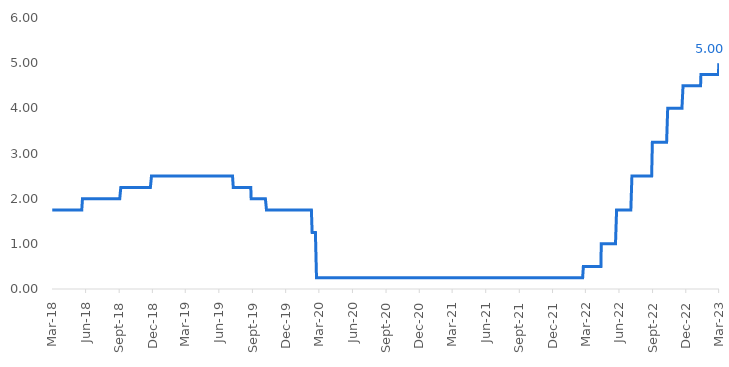
| Category | DFEDTARU |
|---|---|
| 2018-03-23 | 1.75 |
| 2018-03-24 | 1.75 |
| 2018-03-25 | 1.75 |
| 2018-03-26 | 1.75 |
| 2018-03-27 | 1.75 |
| 2018-03-28 | 1.75 |
| 2018-03-29 | 1.75 |
| 2018-03-30 | 1.75 |
| 2018-03-31 | 1.75 |
| 2018-04-01 | 1.75 |
| 2018-04-02 | 1.75 |
| 2018-04-03 | 1.75 |
| 2018-04-04 | 1.75 |
| 2018-04-05 | 1.75 |
| 2018-04-06 | 1.75 |
| 2018-04-07 | 1.75 |
| 2018-04-08 | 1.75 |
| 2018-04-09 | 1.75 |
| 2018-04-10 | 1.75 |
| 2018-04-11 | 1.75 |
| 2018-04-12 | 1.75 |
| 2018-04-13 | 1.75 |
| 2018-04-14 | 1.75 |
| 2018-04-15 | 1.75 |
| 2018-04-16 | 1.75 |
| 2018-04-17 | 1.75 |
| 2018-04-18 | 1.75 |
| 2018-04-19 | 1.75 |
| 2018-04-20 | 1.75 |
| 2018-04-21 | 1.75 |
| 2018-04-22 | 1.75 |
| 2018-04-23 | 1.75 |
| 2018-04-24 | 1.75 |
| 2018-04-25 | 1.75 |
| 2018-04-26 | 1.75 |
| 2018-04-27 | 1.75 |
| 2018-04-28 | 1.75 |
| 2018-04-29 | 1.75 |
| 2018-04-30 | 1.75 |
| 2018-05-01 | 1.75 |
| 2018-05-02 | 1.75 |
| 2018-05-03 | 1.75 |
| 2018-05-04 | 1.75 |
| 2018-05-05 | 1.75 |
| 2018-05-06 | 1.75 |
| 2018-05-07 | 1.75 |
| 2018-05-08 | 1.75 |
| 2018-05-09 | 1.75 |
| 2018-05-10 | 1.75 |
| 2018-05-11 | 1.75 |
| 2018-05-12 | 1.75 |
| 2018-05-13 | 1.75 |
| 2018-05-14 | 1.75 |
| 2018-05-15 | 1.75 |
| 2018-05-16 | 1.75 |
| 2018-05-17 | 1.75 |
| 2018-05-18 | 1.75 |
| 2018-05-19 | 1.75 |
| 2018-05-20 | 1.75 |
| 2018-05-21 | 1.75 |
| 2018-05-22 | 1.75 |
| 2018-05-23 | 1.75 |
| 2018-05-24 | 1.75 |
| 2018-05-25 | 1.75 |
| 2018-05-26 | 1.75 |
| 2018-05-27 | 1.75 |
| 2018-05-28 | 1.75 |
| 2018-05-29 | 1.75 |
| 2018-05-30 | 1.75 |
| 2018-05-31 | 1.75 |
| 2018-06-01 | 1.75 |
| 2018-06-02 | 1.75 |
| 2018-06-03 | 1.75 |
| 2018-06-04 | 1.75 |
| 2018-06-05 | 1.75 |
| 2018-06-06 | 1.75 |
| 2018-06-07 | 1.75 |
| 2018-06-08 | 1.75 |
| 2018-06-09 | 1.75 |
| 2018-06-10 | 1.75 |
| 2018-06-11 | 1.75 |
| 2018-06-12 | 1.75 |
| 2018-06-13 | 1.75 |
| 2018-06-14 | 2 |
| 2018-06-15 | 2 |
| 2018-06-16 | 2 |
| 2018-06-17 | 2 |
| 2018-06-18 | 2 |
| 2018-06-19 | 2 |
| 2018-06-20 | 2 |
| 2018-06-21 | 2 |
| 2018-06-22 | 2 |
| 2018-06-23 | 2 |
| 2018-06-24 | 2 |
| 2018-06-25 | 2 |
| 2018-06-26 | 2 |
| 2018-06-27 | 2 |
| 2018-06-28 | 2 |
| 2018-06-29 | 2 |
| 2018-06-30 | 2 |
| 2018-07-01 | 2 |
| 2018-07-02 | 2 |
| 2018-07-03 | 2 |
| 2018-07-04 | 2 |
| 2018-07-05 | 2 |
| 2018-07-06 | 2 |
| 2018-07-07 | 2 |
| 2018-07-08 | 2 |
| 2018-07-09 | 2 |
| 2018-07-10 | 2 |
| 2018-07-11 | 2 |
| 2018-07-12 | 2 |
| 2018-07-13 | 2 |
| 2018-07-14 | 2 |
| 2018-07-15 | 2 |
| 2018-07-16 | 2 |
| 2018-07-17 | 2 |
| 2018-07-18 | 2 |
| 2018-07-19 | 2 |
| 2018-07-20 | 2 |
| 2018-07-21 | 2 |
| 2018-07-22 | 2 |
| 2018-07-23 | 2 |
| 2018-07-24 | 2 |
| 2018-07-25 | 2 |
| 2018-07-26 | 2 |
| 2018-07-27 | 2 |
| 2018-07-28 | 2 |
| 2018-07-29 | 2 |
| 2018-07-30 | 2 |
| 2018-07-31 | 2 |
| 2018-08-01 | 2 |
| 2018-08-02 | 2 |
| 2018-08-03 | 2 |
| 2018-08-04 | 2 |
| 2018-08-05 | 2 |
| 2018-08-06 | 2 |
| 2018-08-07 | 2 |
| 2018-08-08 | 2 |
| 2018-08-09 | 2 |
| 2018-08-10 | 2 |
| 2018-08-11 | 2 |
| 2018-08-12 | 2 |
| 2018-08-13 | 2 |
| 2018-08-14 | 2 |
| 2018-08-15 | 2 |
| 2018-08-16 | 2 |
| 2018-08-17 | 2 |
| 2018-08-18 | 2 |
| 2018-08-19 | 2 |
| 2018-08-20 | 2 |
| 2018-08-21 | 2 |
| 2018-08-22 | 2 |
| 2018-08-23 | 2 |
| 2018-08-24 | 2 |
| 2018-08-25 | 2 |
| 2018-08-26 | 2 |
| 2018-08-27 | 2 |
| 2018-08-28 | 2 |
| 2018-08-29 | 2 |
| 2018-08-30 | 2 |
| 2018-08-31 | 2 |
| 2018-09-01 | 2 |
| 2018-09-02 | 2 |
| 2018-09-03 | 2 |
| 2018-09-04 | 2 |
| 2018-09-05 | 2 |
| 2018-09-06 | 2 |
| 2018-09-07 | 2 |
| 2018-09-08 | 2 |
| 2018-09-09 | 2 |
| 2018-09-10 | 2 |
| 2018-09-11 | 2 |
| 2018-09-12 | 2 |
| 2018-09-13 | 2 |
| 2018-09-14 | 2 |
| 2018-09-15 | 2 |
| 2018-09-16 | 2 |
| 2018-09-17 | 2 |
| 2018-09-18 | 2 |
| 2018-09-19 | 2 |
| 2018-09-20 | 2 |
| 2018-09-21 | 2 |
| 2018-09-22 | 2 |
| 2018-09-23 | 2 |
| 2018-09-24 | 2 |
| 2018-09-25 | 2 |
| 2018-09-26 | 2 |
| 2018-09-27 | 2.25 |
| 2018-09-28 | 2.25 |
| 2018-09-29 | 2.25 |
| 2018-09-30 | 2.25 |
| 2018-10-01 | 2.25 |
| 2018-10-02 | 2.25 |
| 2018-10-03 | 2.25 |
| 2018-10-04 | 2.25 |
| 2018-10-05 | 2.25 |
| 2018-10-06 | 2.25 |
| 2018-10-07 | 2.25 |
| 2018-10-08 | 2.25 |
| 2018-10-09 | 2.25 |
| 2018-10-10 | 2.25 |
| 2018-10-11 | 2.25 |
| 2018-10-12 | 2.25 |
| 2018-10-13 | 2.25 |
| 2018-10-14 | 2.25 |
| 2018-10-15 | 2.25 |
| 2018-10-16 | 2.25 |
| 2018-10-17 | 2.25 |
| 2018-10-18 | 2.25 |
| 2018-10-19 | 2.25 |
| 2018-10-20 | 2.25 |
| 2018-10-21 | 2.25 |
| 2018-10-22 | 2.25 |
| 2018-10-23 | 2.25 |
| 2018-10-24 | 2.25 |
| 2018-10-25 | 2.25 |
| 2018-10-26 | 2.25 |
| 2018-10-27 | 2.25 |
| 2018-10-28 | 2.25 |
| 2018-10-29 | 2.25 |
| 2018-10-30 | 2.25 |
| 2018-10-31 | 2.25 |
| 2018-11-01 | 2.25 |
| 2018-11-02 | 2.25 |
| 2018-11-03 | 2.25 |
| 2018-11-04 | 2.25 |
| 2018-11-05 | 2.25 |
| 2018-11-06 | 2.25 |
| 2018-11-07 | 2.25 |
| 2018-11-08 | 2.25 |
| 2018-11-09 | 2.25 |
| 2018-11-10 | 2.25 |
| 2018-11-11 | 2.25 |
| 2018-11-12 | 2.25 |
| 2018-11-13 | 2.25 |
| 2018-11-14 | 2.25 |
| 2018-11-15 | 2.25 |
| 2018-11-16 | 2.25 |
| 2018-11-17 | 2.25 |
| 2018-11-18 | 2.25 |
| 2018-11-19 | 2.25 |
| 2018-11-20 | 2.25 |
| 2018-11-21 | 2.25 |
| 2018-11-22 | 2.25 |
| 2018-11-23 | 2.25 |
| 2018-11-24 | 2.25 |
| 2018-11-25 | 2.25 |
| 2018-11-26 | 2.25 |
| 2018-11-27 | 2.25 |
| 2018-11-28 | 2.25 |
| 2018-11-29 | 2.25 |
| 2018-11-30 | 2.25 |
| 2018-12-01 | 2.25 |
| 2018-12-02 | 2.25 |
| 2018-12-03 | 2.25 |
| 2018-12-04 | 2.25 |
| 2018-12-05 | 2.25 |
| 2018-12-06 | 2.25 |
| 2018-12-07 | 2.25 |
| 2018-12-08 | 2.25 |
| 2018-12-09 | 2.25 |
| 2018-12-10 | 2.25 |
| 2018-12-11 | 2.25 |
| 2018-12-12 | 2.25 |
| 2018-12-13 | 2.25 |
| 2018-12-14 | 2.25 |
| 2018-12-15 | 2.25 |
| 2018-12-16 | 2.25 |
| 2018-12-17 | 2.25 |
| 2018-12-18 | 2.25 |
| 2018-12-19 | 2.25 |
| 2018-12-20 | 2.5 |
| 2018-12-21 | 2.5 |
| 2018-12-22 | 2.5 |
| 2018-12-23 | 2.5 |
| 2018-12-24 | 2.5 |
| 2018-12-25 | 2.5 |
| 2018-12-26 | 2.5 |
| 2018-12-27 | 2.5 |
| 2018-12-28 | 2.5 |
| 2018-12-29 | 2.5 |
| 2018-12-30 | 2.5 |
| 2018-12-31 | 2.5 |
| 2019-01-01 | 2.5 |
| 2019-01-02 | 2.5 |
| 2019-01-03 | 2.5 |
| 2019-01-04 | 2.5 |
| 2019-01-05 | 2.5 |
| 2019-01-06 | 2.5 |
| 2019-01-07 | 2.5 |
| 2019-01-08 | 2.5 |
| 2019-01-09 | 2.5 |
| 2019-01-10 | 2.5 |
| 2019-01-11 | 2.5 |
| 2019-01-12 | 2.5 |
| 2019-01-13 | 2.5 |
| 2019-01-14 | 2.5 |
| 2019-01-15 | 2.5 |
| 2019-01-16 | 2.5 |
| 2019-01-17 | 2.5 |
| 2019-01-18 | 2.5 |
| 2019-01-19 | 2.5 |
| 2019-01-20 | 2.5 |
| 2019-01-21 | 2.5 |
| 2019-01-22 | 2.5 |
| 2019-01-23 | 2.5 |
| 2019-01-24 | 2.5 |
| 2019-01-25 | 2.5 |
| 2019-01-26 | 2.5 |
| 2019-01-27 | 2.5 |
| 2019-01-28 | 2.5 |
| 2019-01-29 | 2.5 |
| 2019-01-30 | 2.5 |
| 2019-01-31 | 2.5 |
| 2019-02-01 | 2.5 |
| 2019-02-02 | 2.5 |
| 2019-02-03 | 2.5 |
| 2019-02-04 | 2.5 |
| 2019-02-05 | 2.5 |
| 2019-02-06 | 2.5 |
| 2019-02-07 | 2.5 |
| 2019-02-08 | 2.5 |
| 2019-02-09 | 2.5 |
| 2019-02-10 | 2.5 |
| 2019-02-11 | 2.5 |
| 2019-02-12 | 2.5 |
| 2019-02-13 | 2.5 |
| 2019-02-14 | 2.5 |
| 2019-02-15 | 2.5 |
| 2019-02-16 | 2.5 |
| 2019-02-17 | 2.5 |
| 2019-02-18 | 2.5 |
| 2019-02-19 | 2.5 |
| 2019-02-20 | 2.5 |
| 2019-02-21 | 2.5 |
| 2019-02-22 | 2.5 |
| 2019-02-23 | 2.5 |
| 2019-02-24 | 2.5 |
| 2019-02-25 | 2.5 |
| 2019-02-26 | 2.5 |
| 2019-02-27 | 2.5 |
| 2019-02-28 | 2.5 |
| 2019-03-01 | 2.5 |
| 2019-03-02 | 2.5 |
| 2019-03-03 | 2.5 |
| 2019-03-04 | 2.5 |
| 2019-03-05 | 2.5 |
| 2019-03-06 | 2.5 |
| 2019-03-07 | 2.5 |
| 2019-03-08 | 2.5 |
| 2019-03-09 | 2.5 |
| 2019-03-10 | 2.5 |
| 2019-03-11 | 2.5 |
| 2019-03-12 | 2.5 |
| 2019-03-13 | 2.5 |
| 2019-03-14 | 2.5 |
| 2019-03-15 | 2.5 |
| 2019-03-16 | 2.5 |
| 2019-03-17 | 2.5 |
| 2019-03-18 | 2.5 |
| 2019-03-19 | 2.5 |
| 2019-03-20 | 2.5 |
| 2019-03-21 | 2.5 |
| 2019-03-22 | 2.5 |
| 2019-03-23 | 2.5 |
| 2019-03-24 | 2.5 |
| 2019-03-25 | 2.5 |
| 2019-03-26 | 2.5 |
| 2019-03-27 | 2.5 |
| 2019-03-28 | 2.5 |
| 2019-03-29 | 2.5 |
| 2019-03-30 | 2.5 |
| 2019-03-31 | 2.5 |
| 2019-04-01 | 2.5 |
| 2019-04-02 | 2.5 |
| 2019-04-03 | 2.5 |
| 2019-04-04 | 2.5 |
| 2019-04-05 | 2.5 |
| 2019-04-06 | 2.5 |
| 2019-04-07 | 2.5 |
| 2019-04-08 | 2.5 |
| 2019-04-09 | 2.5 |
| 2019-04-10 | 2.5 |
| 2019-04-11 | 2.5 |
| 2019-04-12 | 2.5 |
| 2019-04-13 | 2.5 |
| 2019-04-14 | 2.5 |
| 2019-04-15 | 2.5 |
| 2019-04-16 | 2.5 |
| 2019-04-17 | 2.5 |
| 2019-04-18 | 2.5 |
| 2019-04-19 | 2.5 |
| 2019-04-20 | 2.5 |
| 2019-04-21 | 2.5 |
| 2019-04-22 | 2.5 |
| 2019-04-23 | 2.5 |
| 2019-04-24 | 2.5 |
| 2019-04-25 | 2.5 |
| 2019-04-26 | 2.5 |
| 2019-04-27 | 2.5 |
| 2019-04-28 | 2.5 |
| 2019-04-29 | 2.5 |
| 2019-04-30 | 2.5 |
| 2019-05-01 | 2.5 |
| 2019-05-02 | 2.5 |
| 2019-05-03 | 2.5 |
| 2019-05-04 | 2.5 |
| 2019-05-05 | 2.5 |
| 2019-05-06 | 2.5 |
| 2019-05-07 | 2.5 |
| 2019-05-08 | 2.5 |
| 2019-05-09 | 2.5 |
| 2019-05-10 | 2.5 |
| 2019-05-11 | 2.5 |
| 2019-05-12 | 2.5 |
| 2019-05-13 | 2.5 |
| 2019-05-14 | 2.5 |
| 2019-05-15 | 2.5 |
| 2019-05-16 | 2.5 |
| 2019-05-17 | 2.5 |
| 2019-05-18 | 2.5 |
| 2019-05-19 | 2.5 |
| 2019-05-20 | 2.5 |
| 2019-05-21 | 2.5 |
| 2019-05-22 | 2.5 |
| 2019-05-23 | 2.5 |
| 2019-05-24 | 2.5 |
| 2019-05-25 | 2.5 |
| 2019-05-26 | 2.5 |
| 2019-05-27 | 2.5 |
| 2019-05-28 | 2.5 |
| 2019-05-29 | 2.5 |
| 2019-05-30 | 2.5 |
| 2019-05-31 | 2.5 |
| 2019-06-01 | 2.5 |
| 2019-06-02 | 2.5 |
| 2019-06-03 | 2.5 |
| 2019-06-04 | 2.5 |
| 2019-06-05 | 2.5 |
| 2019-06-06 | 2.5 |
| 2019-06-07 | 2.5 |
| 2019-06-08 | 2.5 |
| 2019-06-09 | 2.5 |
| 2019-06-10 | 2.5 |
| 2019-06-11 | 2.5 |
| 2019-06-12 | 2.5 |
| 2019-06-13 | 2.5 |
| 2019-06-14 | 2.5 |
| 2019-06-15 | 2.5 |
| 2019-06-16 | 2.5 |
| 2019-06-17 | 2.5 |
| 2019-06-18 | 2.5 |
| 2019-06-19 | 2.5 |
| 2019-06-20 | 2.5 |
| 2019-06-21 | 2.5 |
| 2019-06-22 | 2.5 |
| 2019-06-23 | 2.5 |
| 2019-06-24 | 2.5 |
| 2019-06-25 | 2.5 |
| 2019-06-26 | 2.5 |
| 2019-06-27 | 2.5 |
| 2019-06-28 | 2.5 |
| 2019-06-29 | 2.5 |
| 2019-06-30 | 2.5 |
| 2019-07-01 | 2.5 |
| 2019-07-02 | 2.5 |
| 2019-07-03 | 2.5 |
| 2019-07-04 | 2.5 |
| 2019-07-05 | 2.5 |
| 2019-07-06 | 2.5 |
| 2019-07-07 | 2.5 |
| 2019-07-08 | 2.5 |
| 2019-07-09 | 2.5 |
| 2019-07-10 | 2.5 |
| 2019-07-11 | 2.5 |
| 2019-07-12 | 2.5 |
| 2019-07-13 | 2.5 |
| 2019-07-14 | 2.5 |
| 2019-07-15 | 2.5 |
| 2019-07-16 | 2.5 |
| 2019-07-17 | 2.5 |
| 2019-07-18 | 2.5 |
| 2019-07-19 | 2.5 |
| 2019-07-20 | 2.5 |
| 2019-07-21 | 2.5 |
| 2019-07-22 | 2.5 |
| 2019-07-23 | 2.5 |
| 2019-07-24 | 2.5 |
| 2019-07-25 | 2.5 |
| 2019-07-26 | 2.5 |
| 2019-07-27 | 2.5 |
| 2019-07-28 | 2.5 |
| 2019-07-29 | 2.5 |
| 2019-07-30 | 2.5 |
| 2019-07-31 | 2.5 |
| 2019-08-01 | 2.25 |
| 2019-08-02 | 2.25 |
| 2019-08-03 | 2.25 |
| 2019-08-04 | 2.25 |
| 2019-08-05 | 2.25 |
| 2019-08-06 | 2.25 |
| 2019-08-07 | 2.25 |
| 2019-08-08 | 2.25 |
| 2019-08-09 | 2.25 |
| 2019-08-10 | 2.25 |
| 2019-08-11 | 2.25 |
| 2019-08-12 | 2.25 |
| 2019-08-13 | 2.25 |
| 2019-08-14 | 2.25 |
| 2019-08-15 | 2.25 |
| 2019-08-16 | 2.25 |
| 2019-08-17 | 2.25 |
| 2019-08-18 | 2.25 |
| 2019-08-19 | 2.25 |
| 2019-08-20 | 2.25 |
| 2019-08-21 | 2.25 |
| 2019-08-22 | 2.25 |
| 2019-08-23 | 2.25 |
| 2019-08-24 | 2.25 |
| 2019-08-25 | 2.25 |
| 2019-08-26 | 2.25 |
| 2019-08-27 | 2.25 |
| 2019-08-28 | 2.25 |
| 2019-08-29 | 2.25 |
| 2019-08-30 | 2.25 |
| 2019-08-31 | 2.25 |
| 2019-09-01 | 2.25 |
| 2019-09-02 | 2.25 |
| 2019-09-03 | 2.25 |
| 2019-09-04 | 2.25 |
| 2019-09-05 | 2.25 |
| 2019-09-06 | 2.25 |
| 2019-09-07 | 2.25 |
| 2019-09-08 | 2.25 |
| 2019-09-09 | 2.25 |
| 2019-09-10 | 2.25 |
| 2019-09-11 | 2.25 |
| 2019-09-12 | 2.25 |
| 2019-09-13 | 2.25 |
| 2019-09-14 | 2.25 |
| 2019-09-15 | 2.25 |
| 2019-09-16 | 2.25 |
| 2019-09-17 | 2.25 |
| 2019-09-18 | 2.25 |
| 2019-09-19 | 2 |
| 2019-09-20 | 2 |
| 2019-09-21 | 2 |
| 2019-09-22 | 2 |
| 2019-09-23 | 2 |
| 2019-09-24 | 2 |
| 2019-09-25 | 2 |
| 2019-09-26 | 2 |
| 2019-09-27 | 2 |
| 2019-09-28 | 2 |
| 2019-09-29 | 2 |
| 2019-09-30 | 2 |
| 2019-10-01 | 2 |
| 2019-10-02 | 2 |
| 2019-10-03 | 2 |
| 2019-10-04 | 2 |
| 2019-10-05 | 2 |
| 2019-10-06 | 2 |
| 2019-10-07 | 2 |
| 2019-10-08 | 2 |
| 2019-10-09 | 2 |
| 2019-10-10 | 2 |
| 2019-10-11 | 2 |
| 2019-10-12 | 2 |
| 2019-10-13 | 2 |
| 2019-10-14 | 2 |
| 2019-10-15 | 2 |
| 2019-10-16 | 2 |
| 2019-10-17 | 2 |
| 2019-10-18 | 2 |
| 2019-10-19 | 2 |
| 2019-10-20 | 2 |
| 2019-10-21 | 2 |
| 2019-10-22 | 2 |
| 2019-10-23 | 2 |
| 2019-10-24 | 2 |
| 2019-10-25 | 2 |
| 2019-10-26 | 2 |
| 2019-10-27 | 2 |
| 2019-10-28 | 2 |
| 2019-10-29 | 2 |
| 2019-10-30 | 2 |
| 2019-10-31 | 1.75 |
| 2019-11-01 | 1.75 |
| 2019-11-02 | 1.75 |
| 2019-11-03 | 1.75 |
| 2019-11-04 | 1.75 |
| 2019-11-05 | 1.75 |
| 2019-11-06 | 1.75 |
| 2019-11-07 | 1.75 |
| 2019-11-08 | 1.75 |
| 2019-11-09 | 1.75 |
| 2019-11-10 | 1.75 |
| 2019-11-11 | 1.75 |
| 2019-11-12 | 1.75 |
| 2019-11-13 | 1.75 |
| 2019-11-14 | 1.75 |
| 2019-11-15 | 1.75 |
| 2019-11-16 | 1.75 |
| 2019-11-17 | 1.75 |
| 2019-11-18 | 1.75 |
| 2019-11-19 | 1.75 |
| 2019-11-20 | 1.75 |
| 2019-11-21 | 1.75 |
| 2019-11-22 | 1.75 |
| 2019-11-23 | 1.75 |
| 2019-11-24 | 1.75 |
| 2019-11-25 | 1.75 |
| 2019-11-26 | 1.75 |
| 2019-11-27 | 1.75 |
| 2019-11-28 | 1.75 |
| 2019-11-29 | 1.75 |
| 2019-11-30 | 1.75 |
| 2019-12-01 | 1.75 |
| 2019-12-02 | 1.75 |
| 2019-12-03 | 1.75 |
| 2019-12-04 | 1.75 |
| 2019-12-05 | 1.75 |
| 2019-12-06 | 1.75 |
| 2019-12-07 | 1.75 |
| 2019-12-08 | 1.75 |
| 2019-12-09 | 1.75 |
| 2019-12-10 | 1.75 |
| 2019-12-11 | 1.75 |
| 2019-12-12 | 1.75 |
| 2019-12-13 | 1.75 |
| 2019-12-14 | 1.75 |
| 2019-12-15 | 1.75 |
| 2019-12-16 | 1.75 |
| 2019-12-17 | 1.75 |
| 2019-12-18 | 1.75 |
| 2019-12-19 | 1.75 |
| 2019-12-20 | 1.75 |
| 2019-12-21 | 1.75 |
| 2019-12-22 | 1.75 |
| 2019-12-23 | 1.75 |
| 2019-12-24 | 1.75 |
| 2019-12-25 | 1.75 |
| 2019-12-26 | 1.75 |
| 2019-12-27 | 1.75 |
| 2019-12-28 | 1.75 |
| 2019-12-29 | 1.75 |
| 2019-12-30 | 1.75 |
| 2019-12-31 | 1.75 |
| 2020-01-01 | 1.75 |
| 2020-01-02 | 1.75 |
| 2020-01-03 | 1.75 |
| 2020-01-04 | 1.75 |
| 2020-01-05 | 1.75 |
| 2020-01-06 | 1.75 |
| 2020-01-07 | 1.75 |
| 2020-01-08 | 1.75 |
| 2020-01-09 | 1.75 |
| 2020-01-10 | 1.75 |
| 2020-01-11 | 1.75 |
| 2020-01-12 | 1.75 |
| 2020-01-13 | 1.75 |
| 2020-01-14 | 1.75 |
| 2020-01-15 | 1.75 |
| 2020-01-16 | 1.75 |
| 2020-01-17 | 1.75 |
| 2020-01-18 | 1.75 |
| 2020-01-19 | 1.75 |
| 2020-01-20 | 1.75 |
| 2020-01-21 | 1.75 |
| 2020-01-22 | 1.75 |
| 2020-01-23 | 1.75 |
| 2020-01-24 | 1.75 |
| 2020-01-25 | 1.75 |
| 2020-01-26 | 1.75 |
| 2020-01-27 | 1.75 |
| 2020-01-28 | 1.75 |
| 2020-01-29 | 1.75 |
| 2020-01-30 | 1.75 |
| 2020-01-31 | 1.75 |
| 2020-02-01 | 1.75 |
| 2020-02-02 | 1.75 |
| 2020-02-03 | 1.75 |
| 2020-02-04 | 1.75 |
| 2020-02-05 | 1.75 |
| 2020-02-06 | 1.75 |
| 2020-02-07 | 1.75 |
| 2020-02-08 | 1.75 |
| 2020-02-09 | 1.75 |
| 2020-02-10 | 1.75 |
| 2020-02-11 | 1.75 |
| 2020-02-12 | 1.75 |
| 2020-02-13 | 1.75 |
| 2020-02-14 | 1.75 |
| 2020-02-15 | 1.75 |
| 2020-02-16 | 1.75 |
| 2020-02-17 | 1.75 |
| 2020-02-18 | 1.75 |
| 2020-02-19 | 1.75 |
| 2020-02-20 | 1.75 |
| 2020-02-21 | 1.75 |
| 2020-02-22 | 1.75 |
| 2020-02-23 | 1.75 |
| 2020-02-24 | 1.75 |
| 2020-02-25 | 1.75 |
| 2020-02-26 | 1.75 |
| 2020-02-27 | 1.75 |
| 2020-02-28 | 1.75 |
| 2020-02-29 | 1.75 |
| 2020-03-01 | 1.75 |
| 2020-03-02 | 1.75 |
| 2020-03-03 | 1.75 |
| 2020-03-04 | 1.25 |
| 2020-03-05 | 1.25 |
| 2020-03-06 | 1.25 |
| 2020-03-07 | 1.25 |
| 2020-03-08 | 1.25 |
| 2020-03-09 | 1.25 |
| 2020-03-10 | 1.25 |
| 2020-03-11 | 1.25 |
| 2020-03-12 | 1.25 |
| 2020-03-13 | 1.25 |
| 2020-03-14 | 1.25 |
| 2020-03-15 | 1.25 |
| 2020-03-16 | 0.25 |
| 2020-03-17 | 0.25 |
| 2020-03-18 | 0.25 |
| 2020-03-19 | 0.25 |
| 2020-03-20 | 0.25 |
| 2020-03-21 | 0.25 |
| 2020-03-22 | 0.25 |
| 2020-03-23 | 0.25 |
| 2020-03-24 | 0.25 |
| 2020-03-25 | 0.25 |
| 2020-03-26 | 0.25 |
| 2020-03-27 | 0.25 |
| 2020-03-28 | 0.25 |
| 2020-03-29 | 0.25 |
| 2020-03-30 | 0.25 |
| 2020-03-31 | 0.25 |
| 2020-04-01 | 0.25 |
| 2020-04-02 | 0.25 |
| 2020-04-03 | 0.25 |
| 2020-04-04 | 0.25 |
| 2020-04-05 | 0.25 |
| 2020-04-06 | 0.25 |
| 2020-04-07 | 0.25 |
| 2020-04-08 | 0.25 |
| 2020-04-09 | 0.25 |
| 2020-04-10 | 0.25 |
| 2020-04-11 | 0.25 |
| 2020-04-12 | 0.25 |
| 2020-04-13 | 0.25 |
| 2020-04-14 | 0.25 |
| 2020-04-15 | 0.25 |
| 2020-04-16 | 0.25 |
| 2020-04-17 | 0.25 |
| 2020-04-18 | 0.25 |
| 2020-04-19 | 0.25 |
| 2020-04-20 | 0.25 |
| 2020-04-21 | 0.25 |
| 2020-04-22 | 0.25 |
| 2020-04-23 | 0.25 |
| 2020-04-24 | 0.25 |
| 2020-04-25 | 0.25 |
| 2020-04-26 | 0.25 |
| 2020-04-27 | 0.25 |
| 2020-04-28 | 0.25 |
| 2020-04-29 | 0.25 |
| 2020-04-30 | 0.25 |
| 2020-05-01 | 0.25 |
| 2020-05-02 | 0.25 |
| 2020-05-03 | 0.25 |
| 2020-05-04 | 0.25 |
| 2020-05-05 | 0.25 |
| 2020-05-06 | 0.25 |
| 2020-05-07 | 0.25 |
| 2020-05-08 | 0.25 |
| 2020-05-09 | 0.25 |
| 2020-05-10 | 0.25 |
| 2020-05-11 | 0.25 |
| 2020-05-12 | 0.25 |
| 2020-05-13 | 0.25 |
| 2020-05-14 | 0.25 |
| 2020-05-15 | 0.25 |
| 2020-05-16 | 0.25 |
| 2020-05-17 | 0.25 |
| 2020-05-18 | 0.25 |
| 2020-05-19 | 0.25 |
| 2020-05-20 | 0.25 |
| 2020-05-21 | 0.25 |
| 2020-05-22 | 0.25 |
| 2020-05-23 | 0.25 |
| 2020-05-24 | 0.25 |
| 2020-05-25 | 0.25 |
| 2020-05-26 | 0.25 |
| 2020-05-27 | 0.25 |
| 2020-05-28 | 0.25 |
| 2020-05-29 | 0.25 |
| 2020-05-30 | 0.25 |
| 2020-05-31 | 0.25 |
| 2020-06-01 | 0.25 |
| 2020-06-02 | 0.25 |
| 2020-06-03 | 0.25 |
| 2020-06-04 | 0.25 |
| 2020-06-05 | 0.25 |
| 2020-06-06 | 0.25 |
| 2020-06-07 | 0.25 |
| 2020-06-08 | 0.25 |
| 2020-06-09 | 0.25 |
| 2020-06-10 | 0.25 |
| 2020-06-11 | 0.25 |
| 2020-06-12 | 0.25 |
| 2020-06-13 | 0.25 |
| 2020-06-14 | 0.25 |
| 2020-06-15 | 0.25 |
| 2020-06-16 | 0.25 |
| 2020-06-17 | 0.25 |
| 2020-06-18 | 0.25 |
| 2020-06-19 | 0.25 |
| 2020-06-20 | 0.25 |
| 2020-06-21 | 0.25 |
| 2020-06-22 | 0.25 |
| 2020-06-23 | 0.25 |
| 2020-06-24 | 0.25 |
| 2020-06-25 | 0.25 |
| 2020-06-26 | 0.25 |
| 2020-06-27 | 0.25 |
| 2020-06-28 | 0.25 |
| 2020-06-29 | 0.25 |
| 2020-06-30 | 0.25 |
| 2020-07-01 | 0.25 |
| 2020-07-02 | 0.25 |
| 2020-07-03 | 0.25 |
| 2020-07-04 | 0.25 |
| 2020-07-05 | 0.25 |
| 2020-07-06 | 0.25 |
| 2020-07-07 | 0.25 |
| 2020-07-08 | 0.25 |
| 2020-07-09 | 0.25 |
| 2020-07-10 | 0.25 |
| 2020-07-11 | 0.25 |
| 2020-07-12 | 0.25 |
| 2020-07-13 | 0.25 |
| 2020-07-14 | 0.25 |
| 2020-07-15 | 0.25 |
| 2020-07-16 | 0.25 |
| 2020-07-17 | 0.25 |
| 2020-07-18 | 0.25 |
| 2020-07-19 | 0.25 |
| 2020-07-20 | 0.25 |
| 2020-07-21 | 0.25 |
| 2020-07-22 | 0.25 |
| 2020-07-23 | 0.25 |
| 2020-07-24 | 0.25 |
| 2020-07-25 | 0.25 |
| 2020-07-26 | 0.25 |
| 2020-07-27 | 0.25 |
| 2020-07-28 | 0.25 |
| 2020-07-29 | 0.25 |
| 2020-07-30 | 0.25 |
| 2020-07-31 | 0.25 |
| 2020-08-01 | 0.25 |
| 2020-08-02 | 0.25 |
| 2020-08-03 | 0.25 |
| 2020-08-04 | 0.25 |
| 2020-08-05 | 0.25 |
| 2020-08-06 | 0.25 |
| 2020-08-07 | 0.25 |
| 2020-08-08 | 0.25 |
| 2020-08-09 | 0.25 |
| 2020-08-10 | 0.25 |
| 2020-08-11 | 0.25 |
| 2020-08-12 | 0.25 |
| 2020-08-13 | 0.25 |
| 2020-08-14 | 0.25 |
| 2020-08-15 | 0.25 |
| 2020-08-16 | 0.25 |
| 2020-08-17 | 0.25 |
| 2020-08-18 | 0.25 |
| 2020-08-19 | 0.25 |
| 2020-08-20 | 0.25 |
| 2020-08-21 | 0.25 |
| 2020-08-22 | 0.25 |
| 2020-08-23 | 0.25 |
| 2020-08-24 | 0.25 |
| 2020-08-25 | 0.25 |
| 2020-08-26 | 0.25 |
| 2020-08-27 | 0.25 |
| 2020-08-28 | 0.25 |
| 2020-08-29 | 0.25 |
| 2020-08-30 | 0.25 |
| 2020-08-31 | 0.25 |
| 2020-09-01 | 0.25 |
| 2020-09-02 | 0.25 |
| 2020-09-03 | 0.25 |
| 2020-09-04 | 0.25 |
| 2020-09-05 | 0.25 |
| 2020-09-06 | 0.25 |
| 2020-09-07 | 0.25 |
| 2020-09-08 | 0.25 |
| 2020-09-09 | 0.25 |
| 2020-09-10 | 0.25 |
| 2020-09-11 | 0.25 |
| 2020-09-12 | 0.25 |
| 2020-09-13 | 0.25 |
| 2020-09-14 | 0.25 |
| 2020-09-15 | 0.25 |
| 2020-09-16 | 0.25 |
| 2020-09-17 | 0.25 |
| 2020-09-18 | 0.25 |
| 2020-09-19 | 0.25 |
| 2020-09-20 | 0.25 |
| 2020-09-21 | 0.25 |
| 2020-09-22 | 0.25 |
| 2020-09-23 | 0.25 |
| 2020-09-24 | 0.25 |
| 2020-09-25 | 0.25 |
| 2020-09-26 | 0.25 |
| 2020-09-27 | 0.25 |
| 2020-09-28 | 0.25 |
| 2020-09-29 | 0.25 |
| 2020-09-30 | 0.25 |
| 2020-10-01 | 0.25 |
| 2020-10-02 | 0.25 |
| 2020-10-03 | 0.25 |
| 2020-10-04 | 0.25 |
| 2020-10-05 | 0.25 |
| 2020-10-06 | 0.25 |
| 2020-10-07 | 0.25 |
| 2020-10-08 | 0.25 |
| 2020-10-09 | 0.25 |
| 2020-10-10 | 0.25 |
| 2020-10-11 | 0.25 |
| 2020-10-12 | 0.25 |
| 2020-10-13 | 0.25 |
| 2020-10-14 | 0.25 |
| 2020-10-15 | 0.25 |
| 2020-10-16 | 0.25 |
| 2020-10-17 | 0.25 |
| 2020-10-18 | 0.25 |
| 2020-10-19 | 0.25 |
| 2020-10-20 | 0.25 |
| 2020-10-21 | 0.25 |
| 2020-10-22 | 0.25 |
| 2020-10-23 | 0.25 |
| 2020-10-24 | 0.25 |
| 2020-10-25 | 0.25 |
| 2020-10-26 | 0.25 |
| 2020-10-27 | 0.25 |
| 2020-10-28 | 0.25 |
| 2020-10-29 | 0.25 |
| 2020-10-30 | 0.25 |
| 2020-10-31 | 0.25 |
| 2020-11-01 | 0.25 |
| 2020-11-02 | 0.25 |
| 2020-11-03 | 0.25 |
| 2020-11-04 | 0.25 |
| 2020-11-05 | 0.25 |
| 2020-11-06 | 0.25 |
| 2020-11-07 | 0.25 |
| 2020-11-08 | 0.25 |
| 2020-11-09 | 0.25 |
| 2020-11-10 | 0.25 |
| 2020-11-11 | 0.25 |
| 2020-11-12 | 0.25 |
| 2020-11-13 | 0.25 |
| 2020-11-14 | 0.25 |
| 2020-11-15 | 0.25 |
| 2020-11-16 | 0.25 |
| 2020-11-17 | 0.25 |
| 2020-11-18 | 0.25 |
| 2020-11-19 | 0.25 |
| 2020-11-20 | 0.25 |
| 2020-11-21 | 0.25 |
| 2020-11-22 | 0.25 |
| 2020-11-23 | 0.25 |
| 2020-11-24 | 0.25 |
| 2020-11-25 | 0.25 |
| 2020-11-26 | 0.25 |
| 2020-11-27 | 0.25 |
| 2020-11-28 | 0.25 |
| 2020-11-29 | 0.25 |
| 2020-11-30 | 0.25 |
| 2020-12-01 | 0.25 |
| 2020-12-02 | 0.25 |
| 2020-12-03 | 0.25 |
| 2020-12-04 | 0.25 |
| 2020-12-05 | 0.25 |
| 2020-12-06 | 0.25 |
| 2020-12-07 | 0.25 |
| 2020-12-08 | 0.25 |
| 2020-12-09 | 0.25 |
| 2020-12-10 | 0.25 |
| 2020-12-11 | 0.25 |
| 2020-12-12 | 0.25 |
| 2020-12-13 | 0.25 |
| 2020-12-14 | 0.25 |
| 2020-12-15 | 0.25 |
| 2020-12-16 | 0.25 |
| 2020-12-17 | 0.25 |
| 2020-12-18 | 0.25 |
| 2020-12-19 | 0.25 |
| 2020-12-20 | 0.25 |
| 2020-12-21 | 0.25 |
| 2020-12-22 | 0.25 |
| 2020-12-23 | 0.25 |
| 2020-12-24 | 0.25 |
| 2020-12-25 | 0.25 |
| 2020-12-26 | 0.25 |
| 2020-12-27 | 0.25 |
| 2020-12-28 | 0.25 |
| 2020-12-29 | 0.25 |
| 2020-12-30 | 0.25 |
| 2020-12-31 | 0.25 |
| 2021-01-01 | 0.25 |
| 2021-01-02 | 0.25 |
| 2021-01-03 | 0.25 |
| 2021-01-04 | 0.25 |
| 2021-01-05 | 0.25 |
| 2021-01-06 | 0.25 |
| 2021-01-07 | 0.25 |
| 2021-01-08 | 0.25 |
| 2021-01-09 | 0.25 |
| 2021-01-10 | 0.25 |
| 2021-01-11 | 0.25 |
| 2021-01-12 | 0.25 |
| 2021-01-13 | 0.25 |
| 2021-01-14 | 0.25 |
| 2021-01-15 | 0.25 |
| 2021-01-16 | 0.25 |
| 2021-01-17 | 0.25 |
| 2021-01-18 | 0.25 |
| 2021-01-19 | 0.25 |
| 2021-01-20 | 0.25 |
| 2021-01-21 | 0.25 |
| 2021-01-22 | 0.25 |
| 2021-01-23 | 0.25 |
| 2021-01-24 | 0.25 |
| 2021-01-25 | 0.25 |
| 2021-01-26 | 0.25 |
| 2021-01-27 | 0.25 |
| 2021-01-28 | 0.25 |
| 2021-01-29 | 0.25 |
| 2021-01-30 | 0.25 |
| 2021-01-31 | 0.25 |
| 2021-02-01 | 0.25 |
| 2021-02-02 | 0.25 |
| 2021-02-03 | 0.25 |
| 2021-02-04 | 0.25 |
| 2021-02-05 | 0.25 |
| 2021-02-06 | 0.25 |
| 2021-02-07 | 0.25 |
| 2021-02-08 | 0.25 |
| 2021-02-09 | 0.25 |
| 2021-02-10 | 0.25 |
| 2021-02-11 | 0.25 |
| 2021-02-12 | 0.25 |
| 2021-02-13 | 0.25 |
| 2021-02-14 | 0.25 |
| 2021-02-15 | 0.25 |
| 2021-02-16 | 0.25 |
| 2021-02-17 | 0.25 |
| 2021-02-18 | 0.25 |
| 2021-02-19 | 0.25 |
| 2021-02-20 | 0.25 |
| 2021-02-21 | 0.25 |
| 2021-02-22 | 0.25 |
| 2021-02-23 | 0.25 |
| 2021-02-24 | 0.25 |
| 2021-02-25 | 0.25 |
| 2021-02-26 | 0.25 |
| 2021-02-27 | 0.25 |
| 2021-02-28 | 0.25 |
| 2021-03-01 | 0.25 |
| 2021-03-02 | 0.25 |
| 2021-03-03 | 0.25 |
| 2021-03-04 | 0.25 |
| 2021-03-05 | 0.25 |
| 2021-03-06 | 0.25 |
| 2021-03-07 | 0.25 |
| 2021-03-08 | 0.25 |
| 2021-03-09 | 0.25 |
| 2021-03-10 | 0.25 |
| 2021-03-11 | 0.25 |
| 2021-03-12 | 0.25 |
| 2021-03-13 | 0.25 |
| 2021-03-14 | 0.25 |
| 2021-03-15 | 0.25 |
| 2021-03-16 | 0.25 |
| 2021-03-17 | 0.25 |
| 2021-03-18 | 0.25 |
| 2021-03-19 | 0.25 |
| 2021-03-20 | 0.25 |
| 2021-03-21 | 0.25 |
| 2021-03-22 | 0.25 |
| 2021-03-23 | 0.25 |
| 2021-03-24 | 0.25 |
| 2021-03-25 | 0.25 |
| 2021-03-26 | 0.25 |
| 2021-03-27 | 0.25 |
| 2021-03-28 | 0.25 |
| 2021-03-29 | 0.25 |
| 2021-03-30 | 0.25 |
| 2021-03-31 | 0.25 |
| 2021-04-01 | 0.25 |
| 2021-04-02 | 0.25 |
| 2021-04-03 | 0.25 |
| 2021-04-04 | 0.25 |
| 2021-04-05 | 0.25 |
| 2021-04-06 | 0.25 |
| 2021-04-07 | 0.25 |
| 2021-04-08 | 0.25 |
| 2021-04-09 | 0.25 |
| 2021-04-10 | 0.25 |
| 2021-04-11 | 0.25 |
| 2021-04-12 | 0.25 |
| 2021-04-13 | 0.25 |
| 2021-04-14 | 0.25 |
| 2021-04-15 | 0.25 |
| 2021-04-16 | 0.25 |
| 2021-04-17 | 0.25 |
| 2021-04-18 | 0.25 |
| 2021-04-19 | 0.25 |
| 2021-04-20 | 0.25 |
| 2021-04-21 | 0.25 |
| 2021-04-22 | 0.25 |
| 2021-04-23 | 0.25 |
| 2021-04-24 | 0.25 |
| 2021-04-25 | 0.25 |
| 2021-04-26 | 0.25 |
| 2021-04-27 | 0.25 |
| 2021-04-28 | 0.25 |
| 2021-04-29 | 0.25 |
| 2021-04-30 | 0.25 |
| 2021-05-01 | 0.25 |
| 2021-05-02 | 0.25 |
| 2021-05-03 | 0.25 |
| 2021-05-04 | 0.25 |
| 2021-05-05 | 0.25 |
| 2021-05-06 | 0.25 |
| 2021-05-07 | 0.25 |
| 2021-05-08 | 0.25 |
| 2021-05-09 | 0.25 |
| 2021-05-10 | 0.25 |
| 2021-05-11 | 0.25 |
| 2021-05-12 | 0.25 |
| 2021-05-13 | 0.25 |
| 2021-05-14 | 0.25 |
| 2021-05-15 | 0.25 |
| 2021-05-16 | 0.25 |
| 2021-05-17 | 0.25 |
| 2021-05-18 | 0.25 |
| 2021-05-19 | 0.25 |
| 2021-05-20 | 0.25 |
| 2021-05-21 | 0.25 |
| 2021-05-22 | 0.25 |
| 2021-05-23 | 0.25 |
| 2021-05-24 | 0.25 |
| 2021-05-25 | 0.25 |
| 2021-05-26 | 0.25 |
| 2021-05-27 | 0.25 |
| 2021-05-28 | 0.25 |
| 2021-05-29 | 0.25 |
| 2021-05-30 | 0.25 |
| 2021-05-31 | 0.25 |
| 2021-06-01 | 0.25 |
| 2021-06-02 | 0.25 |
| 2021-06-03 | 0.25 |
| 2021-06-04 | 0.25 |
| 2021-06-05 | 0.25 |
| 2021-06-06 | 0.25 |
| 2021-06-07 | 0.25 |
| 2021-06-08 | 0.25 |
| 2021-06-09 | 0.25 |
| 2021-06-10 | 0.25 |
| 2021-06-11 | 0.25 |
| 2021-06-12 | 0.25 |
| 2021-06-13 | 0.25 |
| 2021-06-14 | 0.25 |
| 2021-06-15 | 0.25 |
| 2021-06-16 | 0.25 |
| 2021-06-17 | 0.25 |
| 2021-06-18 | 0.25 |
| 2021-06-19 | 0.25 |
| 2021-06-20 | 0.25 |
| 2021-06-21 | 0.25 |
| 2021-06-22 | 0.25 |
| 2021-06-23 | 0.25 |
| 2021-06-24 | 0.25 |
| 2021-06-25 | 0.25 |
| 2021-06-26 | 0.25 |
| 2021-06-27 | 0.25 |
| 2021-06-28 | 0.25 |
| 2021-06-29 | 0.25 |
| 2021-06-30 | 0.25 |
| 2021-07-01 | 0.25 |
| 2021-07-02 | 0.25 |
| 2021-07-03 | 0.25 |
| 2021-07-04 | 0.25 |
| 2021-07-05 | 0.25 |
| 2021-07-06 | 0.25 |
| 2021-07-07 | 0.25 |
| 2021-07-08 | 0.25 |
| 2021-07-09 | 0.25 |
| 2021-07-10 | 0.25 |
| 2021-07-11 | 0.25 |
| 2021-07-12 | 0.25 |
| 2021-07-13 | 0.25 |
| 2021-07-14 | 0.25 |
| 2021-07-15 | 0.25 |
| 2021-07-16 | 0.25 |
| 2021-07-17 | 0.25 |
| 2021-07-18 | 0.25 |
| 2021-07-19 | 0.25 |
| 2021-07-20 | 0.25 |
| 2021-07-21 | 0.25 |
| 2021-07-22 | 0.25 |
| 2021-07-23 | 0.25 |
| 2021-07-24 | 0.25 |
| 2021-07-25 | 0.25 |
| 2021-07-26 | 0.25 |
| 2021-07-27 | 0.25 |
| 2021-07-28 | 0.25 |
| 2021-07-29 | 0.25 |
| 2021-07-30 | 0.25 |
| 2021-07-31 | 0.25 |
| 2021-08-01 | 0.25 |
| 2021-08-02 | 0.25 |
| 2021-08-03 | 0.25 |
| 2021-08-04 | 0.25 |
| 2021-08-05 | 0.25 |
| 2021-08-06 | 0.25 |
| 2021-08-07 | 0.25 |
| 2021-08-08 | 0.25 |
| 2021-08-09 | 0.25 |
| 2021-08-10 | 0.25 |
| 2021-08-11 | 0.25 |
| 2021-08-12 | 0.25 |
| 2021-08-13 | 0.25 |
| 2021-08-14 | 0.25 |
| 2021-08-15 | 0.25 |
| 2021-08-16 | 0.25 |
| 2021-08-17 | 0.25 |
| 2021-08-18 | 0.25 |
| 2021-08-19 | 0.25 |
| 2021-08-20 | 0.25 |
| 2021-08-21 | 0.25 |
| 2021-08-22 | 0.25 |
| 2021-08-23 | 0.25 |
| 2021-08-24 | 0.25 |
| 2021-08-25 | 0.25 |
| 2021-08-26 | 0.25 |
| 2021-08-27 | 0.25 |
| 2021-08-28 | 0.25 |
| 2021-08-29 | 0.25 |
| 2021-08-30 | 0.25 |
| 2021-08-31 | 0.25 |
| 2021-09-01 | 0.25 |
| 2021-09-02 | 0.25 |
| 2021-09-03 | 0.25 |
| 2021-09-04 | 0.25 |
| 2021-09-05 | 0.25 |
| 2021-09-06 | 0.25 |
| 2021-09-07 | 0.25 |
| 2021-09-08 | 0.25 |
| 2021-09-09 | 0.25 |
| 2021-09-10 | 0.25 |
| 2021-09-11 | 0.25 |
| 2021-09-12 | 0.25 |
| 2021-09-13 | 0.25 |
| 2021-09-14 | 0.25 |
| 2021-09-15 | 0.25 |
| 2021-09-16 | 0.25 |
| 2021-09-17 | 0.25 |
| 2021-09-18 | 0.25 |
| 2021-09-19 | 0.25 |
| 2021-09-20 | 0.25 |
| 2021-09-21 | 0.25 |
| 2021-09-22 | 0.25 |
| 2021-09-23 | 0.25 |
| 2021-09-24 | 0.25 |
| 2021-09-25 | 0.25 |
| 2021-09-26 | 0.25 |
| 2021-09-27 | 0.25 |
| 2021-09-28 | 0.25 |
| 2021-09-29 | 0.25 |
| 2021-09-30 | 0.25 |
| 2021-10-01 | 0.25 |
| 2021-10-02 | 0.25 |
| 2021-10-03 | 0.25 |
| 2021-10-04 | 0.25 |
| 2021-10-05 | 0.25 |
| 2021-10-06 | 0.25 |
| 2021-10-07 | 0.25 |
| 2021-10-08 | 0.25 |
| 2021-10-09 | 0.25 |
| 2021-10-10 | 0.25 |
| 2021-10-11 | 0.25 |
| 2021-10-12 | 0.25 |
| 2021-10-13 | 0.25 |
| 2021-10-14 | 0.25 |
| 2021-10-15 | 0.25 |
| 2021-10-16 | 0.25 |
| 2021-10-17 | 0.25 |
| 2021-10-18 | 0.25 |
| 2021-10-19 | 0.25 |
| 2021-10-20 | 0.25 |
| 2021-10-21 | 0.25 |
| 2021-10-22 | 0.25 |
| 2021-10-23 | 0.25 |
| 2021-10-24 | 0.25 |
| 2021-10-25 | 0.25 |
| 2021-10-26 | 0.25 |
| 2021-10-27 | 0.25 |
| 2021-10-28 | 0.25 |
| 2021-10-29 | 0.25 |
| 2021-10-30 | 0.25 |
| 2021-10-31 | 0.25 |
| 2021-11-01 | 0.25 |
| 2021-11-02 | 0.25 |
| 2021-11-03 | 0.25 |
| 2021-11-04 | 0.25 |
| 2021-11-05 | 0.25 |
| 2021-11-06 | 0.25 |
| 2021-11-07 | 0.25 |
| 2021-11-08 | 0.25 |
| 2021-11-09 | 0.25 |
| 2021-11-10 | 0.25 |
| 2021-11-11 | 0.25 |
| 2021-11-12 | 0.25 |
| 2021-11-13 | 0.25 |
| 2021-11-14 | 0.25 |
| 2021-11-15 | 0.25 |
| 2021-11-16 | 0.25 |
| 2021-11-17 | 0.25 |
| 2021-11-18 | 0.25 |
| 2021-11-19 | 0.25 |
| 2021-11-20 | 0.25 |
| 2021-11-21 | 0.25 |
| 2021-11-22 | 0.25 |
| 2021-11-23 | 0.25 |
| 2021-11-24 | 0.25 |
| 2021-11-25 | 0.25 |
| 2021-11-26 | 0.25 |
| 2021-11-27 | 0.25 |
| 2021-11-28 | 0.25 |
| 2021-11-29 | 0.25 |
| 2021-11-30 | 0.25 |
| 2021-12-01 | 0.25 |
| 2021-12-02 | 0.25 |
| 2021-12-03 | 0.25 |
| 2021-12-04 | 0.25 |
| 2021-12-05 | 0.25 |
| 2021-12-06 | 0.25 |
| 2021-12-07 | 0.25 |
| 2021-12-08 | 0.25 |
| 2021-12-09 | 0.25 |
| 2021-12-10 | 0.25 |
| 2021-12-11 | 0.25 |
| 2021-12-12 | 0.25 |
| 2021-12-13 | 0.25 |
| 2021-12-14 | 0.25 |
| 2021-12-15 | 0.25 |
| 2021-12-16 | 0.25 |
| 2021-12-17 | 0.25 |
| 2021-12-18 | 0.25 |
| 2021-12-19 | 0.25 |
| 2021-12-20 | 0.25 |
| 2021-12-21 | 0.25 |
| 2021-12-22 | 0.25 |
| 2021-12-23 | 0.25 |
| 2021-12-24 | 0.25 |
| 2021-12-25 | 0.25 |
| 2021-12-26 | 0.25 |
| 2021-12-27 | 0.25 |
| 2021-12-28 | 0.25 |
| 2021-12-29 | 0.25 |
| 2021-12-30 | 0.25 |
| 2021-12-31 | 0.25 |
| 2022-01-01 | 0.25 |
| 2022-01-02 | 0.25 |
| 2022-01-03 | 0.25 |
| 2022-01-04 | 0.25 |
| 2022-01-05 | 0.25 |
| 2022-01-06 | 0.25 |
| 2022-01-07 | 0.25 |
| 2022-01-08 | 0.25 |
| 2022-01-09 | 0.25 |
| 2022-01-10 | 0.25 |
| 2022-01-11 | 0.25 |
| 2022-01-12 | 0.25 |
| 2022-01-13 | 0.25 |
| 2022-01-14 | 0.25 |
| 2022-01-15 | 0.25 |
| 2022-01-16 | 0.25 |
| 2022-01-17 | 0.25 |
| 2022-01-18 | 0.25 |
| 2022-01-19 | 0.25 |
| 2022-01-20 | 0.25 |
| 2022-01-21 | 0.25 |
| 2022-01-22 | 0.25 |
| 2022-01-23 | 0.25 |
| 2022-01-24 | 0.25 |
| 2022-01-25 | 0.25 |
| 2022-01-26 | 0.25 |
| 2022-01-27 | 0.25 |
| 2022-01-28 | 0.25 |
| 2022-01-29 | 0.25 |
| 2022-01-30 | 0.25 |
| 2022-01-31 | 0.25 |
| 2022-02-01 | 0.25 |
| 2022-02-02 | 0.25 |
| 2022-02-03 | 0.25 |
| 2022-02-04 | 0.25 |
| 2022-02-05 | 0.25 |
| 2022-02-06 | 0.25 |
| 2022-02-07 | 0.25 |
| 2022-02-08 | 0.25 |
| 2022-02-09 | 0.25 |
| 2022-02-10 | 0.25 |
| 2022-02-11 | 0.25 |
| 2022-02-12 | 0.25 |
| 2022-02-13 | 0.25 |
| 2022-02-14 | 0.25 |
| 2022-02-15 | 0.25 |
| 2022-02-16 | 0.25 |
| 2022-02-17 | 0.25 |
| 2022-02-18 | 0.25 |
| 2022-02-19 | 0.25 |
| 2022-02-20 | 0.25 |
| 2022-02-21 | 0.25 |
| 2022-02-22 | 0.25 |
| 2022-02-23 | 0.25 |
| 2022-02-24 | 0.25 |
| 2022-02-25 | 0.25 |
| 2022-02-26 | 0.25 |
| 2022-02-27 | 0.25 |
| 2022-02-28 | 0.25 |
| 2022-03-01 | 0.25 |
| 2022-03-02 | 0.25 |
| 2022-03-03 | 0.25 |
| 2022-03-04 | 0.25 |
| 2022-03-05 | 0.25 |
| 2022-03-06 | 0.25 |
| 2022-03-07 | 0.25 |
| 2022-03-08 | 0.25 |
| 2022-03-09 | 0.25 |
| 2022-03-10 | 0.25 |
| 2022-03-11 | 0.25 |
| 2022-03-12 | 0.25 |
| 2022-03-13 | 0.25 |
| 2022-03-14 | 0.25 |
| 2022-03-15 | 0.25 |
| 2022-03-16 | 0.25 |
| 2022-03-17 | 0.5 |
| 2022-03-18 | 0.5 |
| 2022-03-19 | 0.5 |
| 2022-03-20 | 0.5 |
| 2022-03-21 | 0.5 |
| 2022-03-22 | 0.5 |
| 2022-03-23 | 0.5 |
| 2022-03-24 | 0.5 |
| 2022-03-25 | 0.5 |
| 2022-03-26 | 0.5 |
| 2022-03-27 | 0.5 |
| 2022-03-28 | 0.5 |
| 2022-03-29 | 0.5 |
| 2022-03-30 | 0.5 |
| 2022-03-31 | 0.5 |
| 2022-04-01 | 0.5 |
| 2022-04-02 | 0.5 |
| 2022-04-03 | 0.5 |
| 2022-04-04 | 0.5 |
| 2022-04-05 | 0.5 |
| 2022-04-06 | 0.5 |
| 2022-04-07 | 0.5 |
| 2022-04-08 | 0.5 |
| 2022-04-09 | 0.5 |
| 2022-04-10 | 0.5 |
| 2022-04-11 | 0.5 |
| 2022-04-12 | 0.5 |
| 2022-04-13 | 0.5 |
| 2022-04-14 | 0.5 |
| 2022-04-15 | 0.5 |
| 2022-04-16 | 0.5 |
| 2022-04-17 | 0.5 |
| 2022-04-18 | 0.5 |
| 2022-04-19 | 0.5 |
| 2022-04-20 | 0.5 |
| 2022-04-21 | 0.5 |
| 2022-04-22 | 0.5 |
| 2022-04-23 | 0.5 |
| 2022-04-24 | 0.5 |
| 2022-04-25 | 0.5 |
| 2022-04-26 | 0.5 |
| 2022-04-27 | 0.5 |
| 2022-04-28 | 0.5 |
| 2022-04-29 | 0.5 |
| 2022-04-30 | 0.5 |
| 2022-05-01 | 0.5 |
| 2022-05-02 | 0.5 |
| 2022-05-03 | 0.5 |
| 2022-05-04 | 0.5 |
| 2022-05-05 | 1 |
| 2022-05-06 | 1 |
| 2022-05-07 | 1 |
| 2022-05-08 | 1 |
| 2022-05-09 | 1 |
| 2022-05-10 | 1 |
| 2022-05-11 | 1 |
| 2022-05-12 | 1 |
| 2022-05-13 | 1 |
| 2022-05-14 | 1 |
| 2022-05-15 | 1 |
| 2022-05-16 | 1 |
| 2022-05-17 | 1 |
| 2022-05-18 | 1 |
| 2022-05-19 | 1 |
| 2022-05-20 | 1 |
| 2022-05-21 | 1 |
| 2022-05-22 | 1 |
| 2022-05-23 | 1 |
| 2022-05-24 | 1 |
| 2022-05-25 | 1 |
| 2022-05-26 | 1 |
| 2022-05-27 | 1 |
| 2022-05-28 | 1 |
| 2022-05-29 | 1 |
| 2022-05-30 | 1 |
| 2022-05-31 | 1 |
| 2022-06-01 | 1 |
| 2022-06-02 | 1 |
| 2022-06-03 | 1 |
| 2022-06-04 | 1 |
| 2022-06-05 | 1 |
| 2022-06-06 | 1 |
| 2022-06-07 | 1 |
| 2022-06-08 | 1 |
| 2022-06-09 | 1 |
| 2022-06-10 | 1 |
| 2022-06-11 | 1 |
| 2022-06-12 | 1 |
| 2022-06-13 | 1 |
| 2022-06-14 | 1 |
| 2022-06-15 | 1 |
| 2022-06-16 | 1.75 |
| 2022-06-17 | 1.75 |
| 2022-06-18 | 1.75 |
| 2022-06-19 | 1.75 |
| 2022-06-20 | 1.75 |
| 2022-06-21 | 1.75 |
| 2022-06-22 | 1.75 |
| 2022-06-23 | 1.75 |
| 2022-06-24 | 1.75 |
| 2022-06-25 | 1.75 |
| 2022-06-26 | 1.75 |
| 2022-06-27 | 1.75 |
| 2022-06-28 | 1.75 |
| 2022-06-29 | 1.75 |
| 2022-06-30 | 1.75 |
| 2022-07-01 | 1.75 |
| 2022-07-02 | 1.75 |
| 2022-07-03 | 1.75 |
| 2022-07-04 | 1.75 |
| 2022-07-05 | 1.75 |
| 2022-07-06 | 1.75 |
| 2022-07-07 | 1.75 |
| 2022-07-08 | 1.75 |
| 2022-07-09 | 1.75 |
| 2022-07-10 | 1.75 |
| 2022-07-11 | 1.75 |
| 2022-07-12 | 1.75 |
| 2022-07-13 | 1.75 |
| 2022-07-14 | 1.75 |
| 2022-07-15 | 1.75 |
| 2022-07-16 | 1.75 |
| 2022-07-17 | 1.75 |
| 2022-07-18 | 1.75 |
| 2022-07-19 | 1.75 |
| 2022-07-20 | 1.75 |
| 2022-07-21 | 1.75 |
| 2022-07-22 | 1.75 |
| 2022-07-23 | 1.75 |
| 2022-07-24 | 1.75 |
| 2022-07-25 | 1.75 |
| 2022-07-26 | 1.75 |
| 2022-07-27 | 1.75 |
| 2022-07-28 | 2.5 |
| 2022-07-29 | 2.5 |
| 2022-07-30 | 2.5 |
| 2022-07-31 | 2.5 |
| 2022-08-01 | 2.5 |
| 2022-08-02 | 2.5 |
| 2022-08-03 | 2.5 |
| 2022-08-04 | 2.5 |
| 2022-08-05 | 2.5 |
| 2022-08-06 | 2.5 |
| 2022-08-07 | 2.5 |
| 2022-08-08 | 2.5 |
| 2022-08-09 | 2.5 |
| 2022-08-10 | 2.5 |
| 2022-08-11 | 2.5 |
| 2022-08-12 | 2.5 |
| 2022-08-13 | 2.5 |
| 2022-08-14 | 2.5 |
| 2022-08-15 | 2.5 |
| 2022-08-16 | 2.5 |
| 2022-08-17 | 2.5 |
| 2022-08-18 | 2.5 |
| 2022-08-19 | 2.5 |
| 2022-08-20 | 2.5 |
| 2022-08-21 | 2.5 |
| 2022-08-22 | 2.5 |
| 2022-08-23 | 2.5 |
| 2022-08-24 | 2.5 |
| 2022-08-25 | 2.5 |
| 2022-08-26 | 2.5 |
| 2022-08-27 | 2.5 |
| 2022-08-28 | 2.5 |
| 2022-08-29 | 2.5 |
| 2022-08-30 | 2.5 |
| 2022-08-31 | 2.5 |
| 2022-09-01 | 2.5 |
| 2022-09-02 | 2.5 |
| 2022-09-03 | 2.5 |
| 2022-09-04 | 2.5 |
| 2022-09-05 | 2.5 |
| 2022-09-06 | 2.5 |
| 2022-09-07 | 2.5 |
| 2022-09-08 | 2.5 |
| 2022-09-09 | 2.5 |
| 2022-09-10 | 2.5 |
| 2022-09-11 | 2.5 |
| 2022-09-12 | 2.5 |
| 2022-09-13 | 2.5 |
| 2022-09-14 | 2.5 |
| 2022-09-15 | 2.5 |
| 2022-09-16 | 2.5 |
| 2022-09-17 | 2.5 |
| 2022-09-18 | 2.5 |
| 2022-09-19 | 2.5 |
| 2022-09-20 | 2.5 |
| 2022-09-21 | 2.5 |
| 2022-09-22 | 3.25 |
| 2022-09-23 | 3.25 |
| 2022-09-24 | 3.25 |
| 2022-09-25 | 3.25 |
| 2022-09-26 | 3.25 |
| 2022-09-27 | 3.25 |
| 2022-09-28 | 3.25 |
| 2022-09-29 | 3.25 |
| 2022-09-30 | 3.25 |
| 2022-10-01 | 3.25 |
| 2022-10-02 | 3.25 |
| 2022-10-03 | 3.25 |
| 2022-10-04 | 3.25 |
| 2022-10-05 | 3.25 |
| 2022-10-06 | 3.25 |
| 2022-10-07 | 3.25 |
| 2022-10-08 | 3.25 |
| 2022-10-09 | 3.25 |
| 2022-10-10 | 3.25 |
| 2022-10-11 | 3.25 |
| 2022-10-12 | 3.25 |
| 2022-10-13 | 3.25 |
| 2022-10-14 | 3.25 |
| 2022-10-15 | 3.25 |
| 2022-10-16 | 3.25 |
| 2022-10-17 | 3.25 |
| 2022-10-18 | 3.25 |
| 2022-10-19 | 3.25 |
| 2022-10-20 | 3.25 |
| 2022-10-21 | 3.25 |
| 2022-10-22 | 3.25 |
| 2022-10-23 | 3.25 |
| 2022-10-24 | 3.25 |
| 2022-10-25 | 3.25 |
| 2022-10-26 | 3.25 |
| 2022-10-27 | 3.25 |
| 2022-10-28 | 3.25 |
| 2022-10-29 | 3.25 |
| 2022-10-30 | 3.25 |
| 2022-10-31 | 3.25 |
| 2022-11-01 | 3.25 |
| 2022-11-02 | 3.25 |
| 2022-11-03 | 4 |
| 2022-11-04 | 4 |
| 2022-11-05 | 4 |
| 2022-11-06 | 4 |
| 2022-11-07 | 4 |
| 2022-11-08 | 4 |
| 2022-11-09 | 4 |
| 2022-11-10 | 4 |
| 2022-11-11 | 4 |
| 2022-11-12 | 4 |
| 2022-11-13 | 4 |
| 2022-11-14 | 4 |
| 2022-11-15 | 4 |
| 2022-11-16 | 4 |
| 2022-11-17 | 4 |
| 2022-11-18 | 4 |
| 2022-11-19 | 4 |
| 2022-11-20 | 4 |
| 2022-11-21 | 4 |
| 2022-11-22 | 4 |
| 2022-11-23 | 4 |
| 2022-11-24 | 4 |
| 2022-11-25 | 4 |
| 2022-11-26 | 4 |
| 2022-11-27 | 4 |
| 2022-11-28 | 4 |
| 2022-11-29 | 4 |
| 2022-11-30 | 4 |
| 2022-12-01 | 4 |
| 2022-12-02 | 4 |
| 2022-12-03 | 4 |
| 2022-12-04 | 4 |
| 2022-12-05 | 4 |
| 2022-12-06 | 4 |
| 2022-12-07 | 4 |
| 2022-12-08 | 4 |
| 2022-12-09 | 4 |
| 2022-12-10 | 4 |
| 2022-12-11 | 4 |
| 2022-12-12 | 4 |
| 2022-12-13 | 4 |
| 2022-12-14 | 4 |
| 2022-12-15 | 4.5 |
| 2022-12-16 | 4.5 |
| 2022-12-17 | 4.5 |
| 2022-12-18 | 4.5 |
| 2022-12-19 | 4.5 |
| 2022-12-20 | 4.5 |
| 2022-12-21 | 4.5 |
| 2022-12-22 | 4.5 |
| 2022-12-23 | 4.5 |
| 2022-12-24 | 4.5 |
| 2022-12-25 | 4.5 |
| 2022-12-26 | 4.5 |
| 2022-12-27 | 4.5 |
| 2022-12-28 | 4.5 |
| 2022-12-29 | 4.5 |
| 2022-12-30 | 4.5 |
| 2022-12-31 | 4.5 |
| 2023-01-01 | 4.5 |
| 2023-01-02 | 4.5 |
| 2023-01-03 | 4.5 |
| 2023-01-04 | 4.5 |
| 2023-01-05 | 4.5 |
| 2023-01-06 | 4.5 |
| 2023-01-07 | 4.5 |
| 2023-01-08 | 4.5 |
| 2023-01-09 | 4.5 |
| 2023-01-10 | 4.5 |
| 2023-01-11 | 4.5 |
| 2023-01-12 | 4.5 |
| 2023-01-13 | 4.5 |
| 2023-01-14 | 4.5 |
| 2023-01-15 | 4.5 |
| 2023-01-16 | 4.5 |
| 2023-01-17 | 4.5 |
| 2023-01-18 | 4.5 |
| 2023-01-19 | 4.5 |
| 2023-01-20 | 4.5 |
| 2023-01-21 | 4.5 |
| 2023-01-22 | 4.5 |
| 2023-01-23 | 4.5 |
| 2023-01-24 | 4.5 |
| 2023-01-25 | 4.5 |
| 2023-01-26 | 4.5 |
| 2023-01-27 | 4.5 |
| 2023-01-28 | 4.5 |
| 2023-01-29 | 4.5 |
| 2023-01-30 | 4.5 |
| 2023-01-31 | 4.5 |
| 2023-02-01 | 4.5 |
| 2023-02-02 | 4.75 |
| 2023-02-03 | 4.75 |
| 2023-02-04 | 4.75 |
| 2023-02-05 | 4.75 |
| 2023-02-06 | 4.75 |
| 2023-02-07 | 4.75 |
| 2023-02-08 | 4.75 |
| 2023-02-09 | 4.75 |
| 2023-02-10 | 4.75 |
| 2023-02-11 | 4.75 |
| 2023-02-12 | 4.75 |
| 2023-02-13 | 4.75 |
| 2023-02-14 | 4.75 |
| 2023-02-15 | 4.75 |
| 2023-02-16 | 4.75 |
| 2023-02-17 | 4.75 |
| 2023-02-18 | 4.75 |
| 2023-02-19 | 4.75 |
| 2023-02-20 | 4.75 |
| 2023-02-21 | 4.75 |
| 2023-02-22 | 4.75 |
| 2023-02-23 | 4.75 |
| 2023-02-24 | 4.75 |
| 2023-02-25 | 4.75 |
| 2023-02-26 | 4.75 |
| 2023-02-27 | 4.75 |
| 2023-02-28 | 4.75 |
| 2023-03-01 | 4.75 |
| 2023-03-02 | 4.75 |
| 2023-03-03 | 4.75 |
| 2023-03-04 | 4.75 |
| 2023-03-05 | 4.75 |
| 2023-03-06 | 4.75 |
| 2023-03-07 | 4.75 |
| 2023-03-08 | 4.75 |
| 2023-03-09 | 4.75 |
| 2023-03-10 | 4.75 |
| 2023-03-11 | 4.75 |
| 2023-03-12 | 4.75 |
| 2023-03-13 | 4.75 |
| 2023-03-14 | 4.75 |
| 2023-03-15 | 4.75 |
| 2023-03-16 | 4.75 |
| 2023-03-17 | 4.75 |
| 2023-03-18 | 4.75 |
| 2023-03-19 | 4.75 |
| 2023-03-20 | 4.75 |
| 2023-03-21 | 4.75 |
| 2023-03-22 | 4.75 |
| 2023-03-23 | 5 |